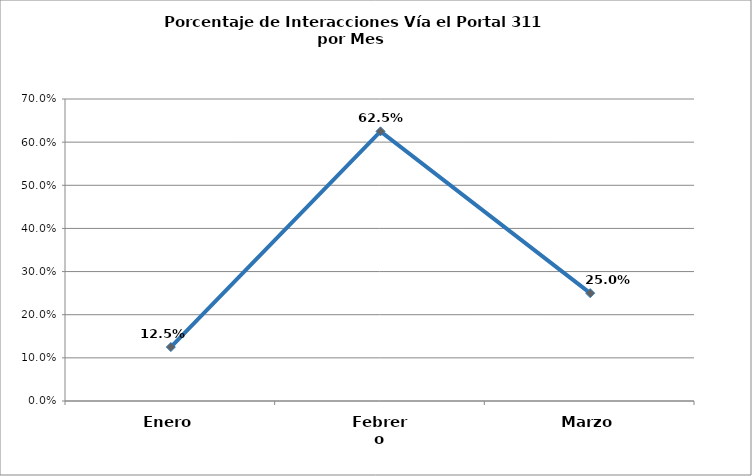
| Category | Series 0 |
|---|---|
| Enero | 0.125 |
| Febrero | 0.625 |
| Marzo | 0.25 |